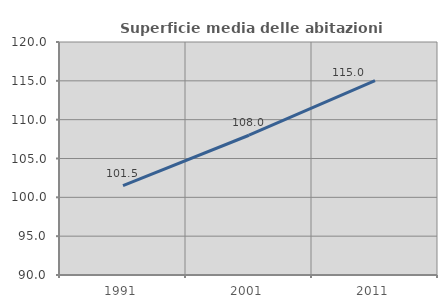
| Category | Superficie media delle abitazioni occupate |
|---|---|
| 1991.0 | 101.516 |
| 2001.0 | 107.995 |
| 2011.0 | 115.033 |